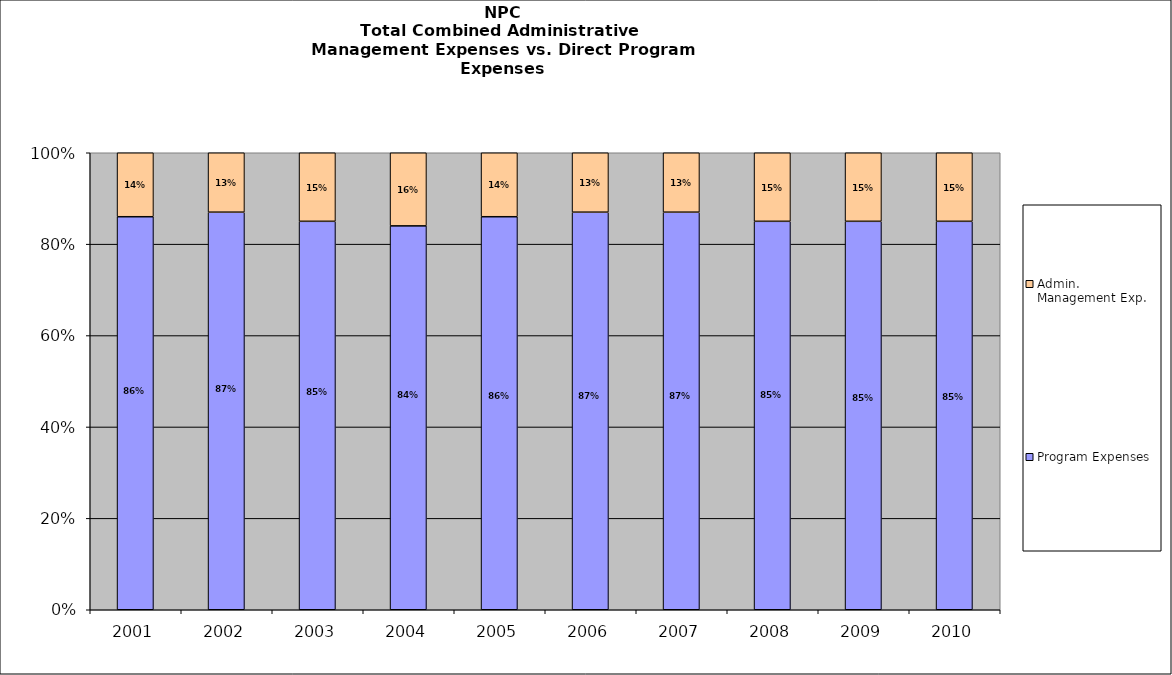
| Category | Program Expenses | Admin. Management Exp. |
|---|---|---|
| 2001.0 | 0.86 | 0.14 |
| 2002.0 | 0.87 | 0.13 |
| 2003.0 | 0.85 | 0.15 |
| 2004.0 | 0.84 | 0.16 |
| 2005.0 | 0.86 | 0.14 |
| 2006.0 | 0.87 | 0.13 |
| 2007.0 | 0.87 | 0.13 |
| 2008.0 | 0.85 | 0.15 |
| 2009.0 | 0.85 | 0.15 |
| 2010.0 | 0.85 | 0.15 |